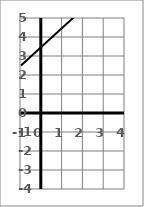
| Category | y |
|---|---|
| -1.0 | 2.5 |
| 0.0 | 3.5 |
| 1.0 | 4.5 |
| 2.0 | 5.5 |
| 3.0 | 6.5 |
| 4.0 | 7.5 |